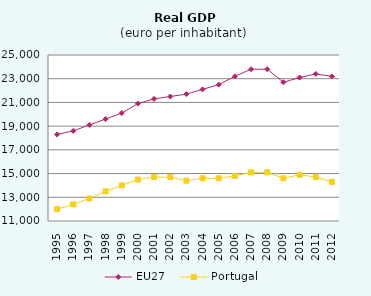
| Category | EU27 | Portugal |
|---|---|---|
| 1995.0 | 18300 | 12000 |
| 1996.0 | 18600 | 12400 |
| 1997.0 | 19100 | 12900 |
| 1998.0 | 19600 | 13500 |
| 1999.0 | 20100 | 14000 |
| 2000.0 | 20900 | 14500 |
| 2001.0 | 21300 | 14700 |
| 2002.0 | 21500 | 14700 |
| 2003.0 | 21700 | 14400 |
| 2004.0 | 22100 | 14600 |
| 2005.0 | 22500 | 14600 |
| 2006.0 | 23200 | 14800 |
| 2007.0 | 23800 | 15100 |
| 2008.0 | 23800 | 15100 |
| 2009.0 | 22700 | 14600 |
| 2010.0 | 23100 | 14900 |
| 2011.0 | 23400 | 14700 |
| 2012.0 | 23200 | 14300 |